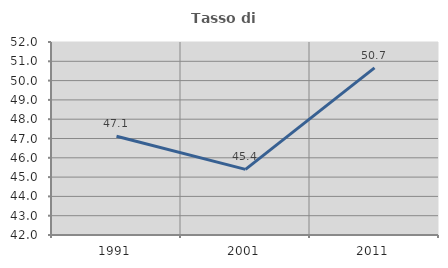
| Category | Tasso di occupazione   |
|---|---|
| 1991.0 | 47.117 |
| 2001.0 | 45.401 |
| 2011.0 | 50.659 |